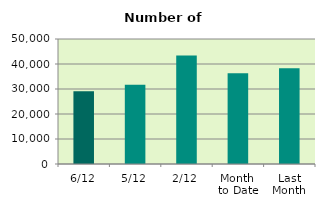
| Category | Series 0 |
|---|---|
| 6/12 | 29124 |
| 5/12 | 31654 |
| 2/12 | 43414 |
| Month 
to Date | 36256.5 |
| Last
Month | 38326.182 |